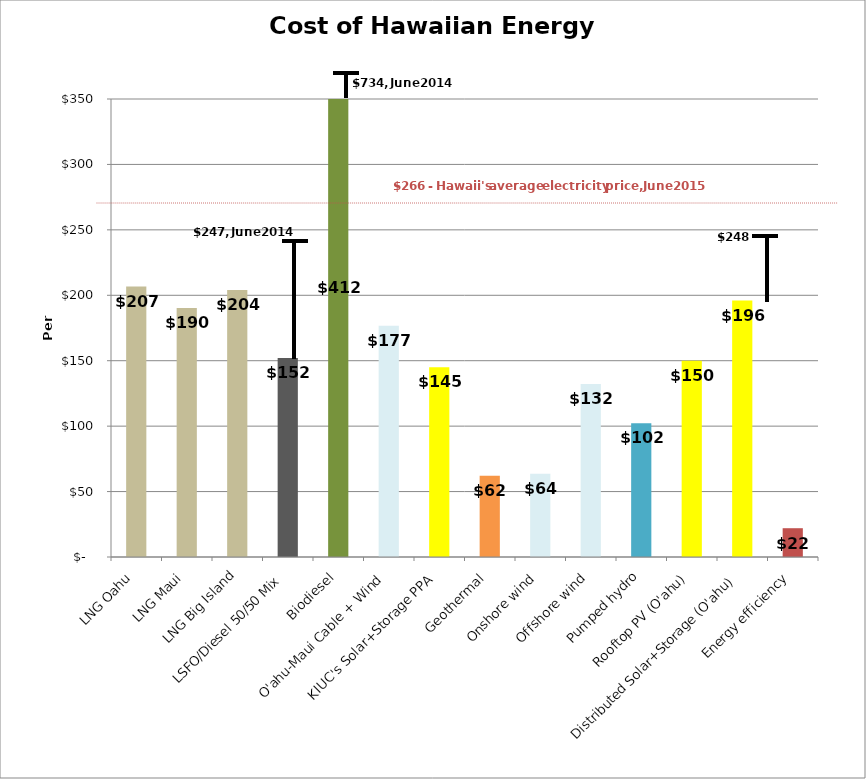
| Category | Series 0 |
|---|---|
| LNG Oahu | 206.677 |
| LNG Maui | 190.268 |
| LNG Big Island | 203.964 |
| LSFO/Diesel 50/50 Mix | 152 |
| Biodiesel | 412 |
| O'ahu-Maui Cable + Wind | 176.734 |
| KIUC's Solar+Storage PPA | 145 |
| Geothermal | 62.058 |
| Onshore wind | 63.62 |
| Offshore wind | 132.223 |
| Pumped hydro | 102.145 |
| Rooftop PV (O'ahu) | 150 |
| Distributed Solar+Storage (O'ahu) | 196 |
| Energy efficiency | 22 |